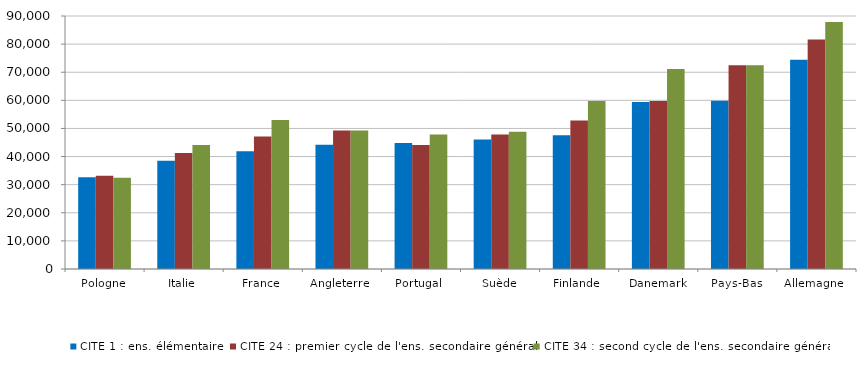
| Category | CITE 1 : ens. élémentaire | CITE 24 : premier cycle de l'ens. secondaire général | CITE 34 : second cycle de l'ens. secondaire général |
|---|---|---|---|
| Pologne | 32678.1 | 33211.485 | 32434.829 |
| Italie | 38492.079 | 41281.359 | 44107.165 |
| France | 41923.692 | 47146.024 | 52963.938 |
| Angleterre  | 44156.969 | 49312.363 | 49312.363 |
| Portugal  | 44830.964 | 44107.566 | 47882.279 |
| Suède | 46031.573 | 47826.097 | 48849.378 |
| Finlande  | 47617.414 | 52866.181 | 59758.739 |
| Danemark | 59388.651 | 59792.695 | 71190.437 |
| Pays-Bas | 59814.059 | 72500.543 | 72500.543 |
| Allemagne  | 74406.735 | 81678.973 | 87822.246 |